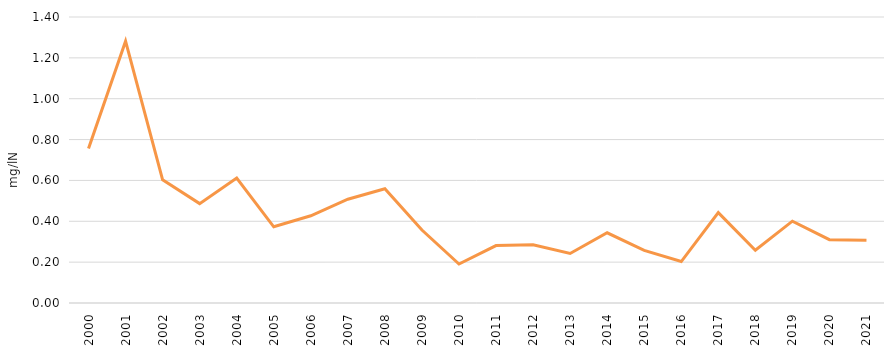
| Category | Вкупен амонијак (mg/lN) |
|---|---|
| 2000.0 | 0.756 |
| 2001.0 | 1.282 |
| 2002.0 | 0.603 |
| 2003.0 | 0.486 |
| 2004.0 | 0.611 |
| 2005.0 | 0.373 |
| 2006.0 | 0.427 |
| 2007.0 | 0.508 |
| 2008.0 | 0.559 |
| 2009.0 | 0.357 |
| 2010.0 | 0.191 |
| 2011.0 | 0.281 |
| 2012.0 | 0.285 |
| 2013.0 | 0.242 |
| 2014.0 | 0.344 |
| 2015.0 | 0.257 |
| 2016.0 | 0.203 |
| 2017.0 | 0.443 |
| 2018.0 | 0.258 |
| 2019.0 | 0.401 |
| 2020.0 | 0.31 |
| 2021.0 | 0.307 |